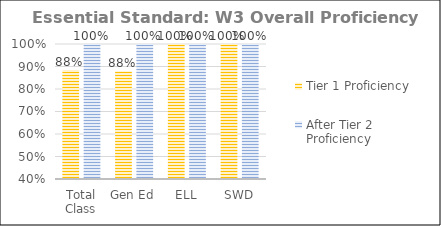
| Category | Tier 1 Proficiency | After Tier 2 Proficiency |
|---|---|---|
| Total Class | 0.885 | 1 |
| Gen Ed | 0.878 | 1 |
| ELL | 1 | 1 |
| SWD | 1 | 1 |